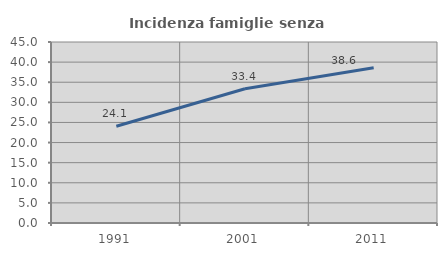
| Category | Incidenza famiglie senza nuclei |
|---|---|
| 1991.0 | 24.053 |
| 2001.0 | 33.387 |
| 2011.0 | 38.602 |